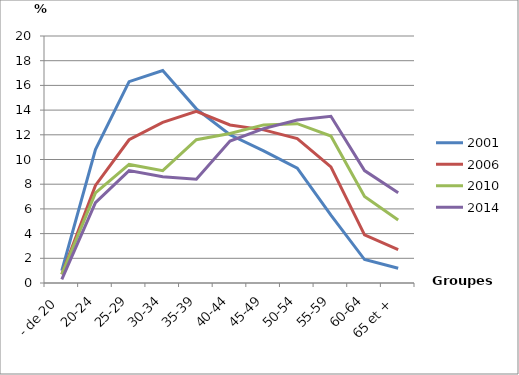
| Category | 2001 | 2006 | 2010 | 2014 |
|---|---|---|---|---|
| - de 20 | 1 | 0.7 | 0.7 | 0.3 |
| 20-24 | 10.8 | 7.9 | 7.3 | 6.5 |
| 25-29 | 16.3 | 11.6 | 9.6 | 9.1 |
| 30-34 | 17.2 | 13 | 9.1 | 8.6 |
| 35-39 | 14.1 | 13.9 | 11.6 | 8.4 |
| 40-44 | 12 | 12.8 | 12.1 | 11.5 |
| 45-49 | 10.7 | 12.4 | 12.8 | 12.5 |
| 50-54 | 9.3 | 11.7 | 12.9 | 13.2 |
| 55-59 | 5.5 | 9.4 | 11.9 | 13.5 |
| 60-64 | 1.9 | 3.9 | 7 | 9.1 |
| 65 et + | 1.2 | 2.7 | 5.1 | 7.3 |